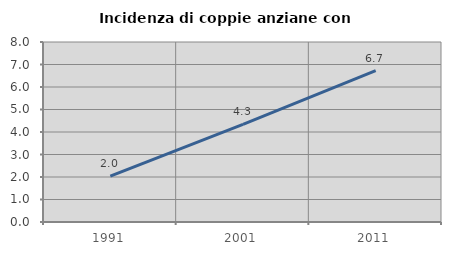
| Category | Incidenza di coppie anziane con figli |
|---|---|
| 1991.0 | 2.042 |
| 2001.0 | 4.341 |
| 2011.0 | 6.73 |